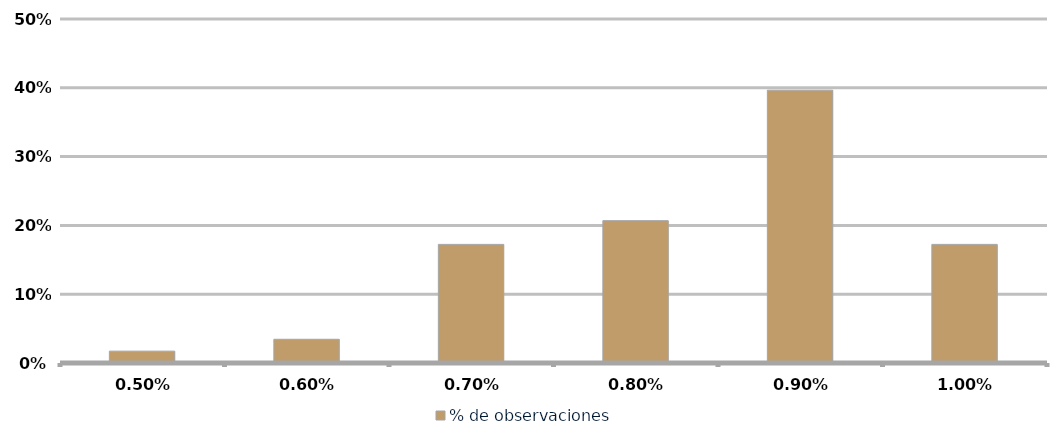
| Category | % de observaciones  |
|---|---|
| 0.005 | 0.017 |
| 0.006 | 0.034 |
| 0.007 | 0.172 |
| 0.008 | 0.207 |
| 0.009 | 0.397 |
| 0.009999999999999998 | 0.172 |